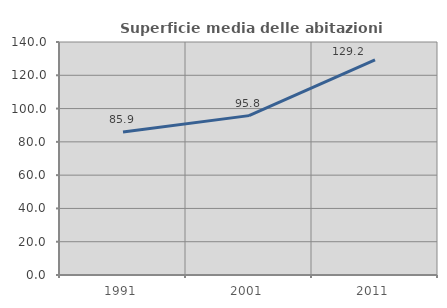
| Category | Superficie media delle abitazioni occupate |
|---|---|
| 1991.0 | 85.859 |
| 2001.0 | 95.766 |
| 2011.0 | 129.208 |